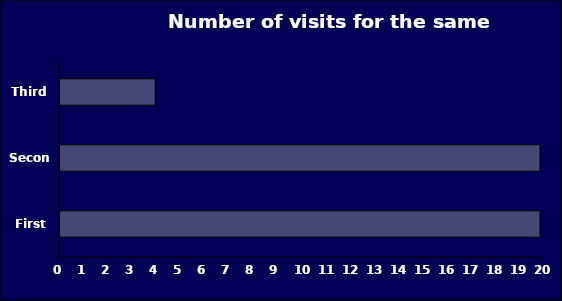
| Category | Series 0 |
|---|---|
| First | 629 |
| Second | 23 |
| Third | 4 |